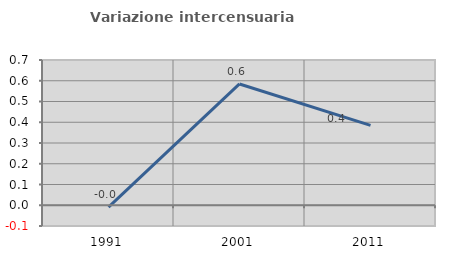
| Category | Variazione intercensuaria annua |
|---|---|
| 1991.0 | -0.009 |
| 2001.0 | 0.585 |
| 2011.0 | 0.385 |